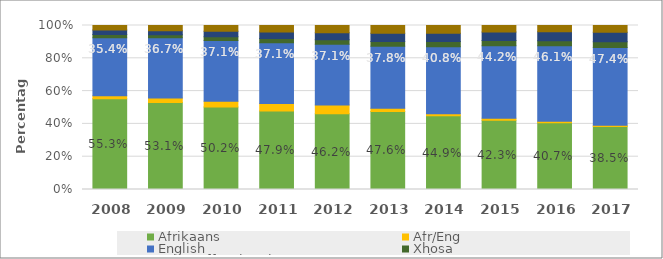
| Category | Afrikaans | Afr/Eng | English | Xhosa | Other official SA languages | Other |
|---|---|---|---|---|---|---|
| 2008 | 0.553 | 0.018 | 0.354 | 0.019 | 0.029 | 0.027 |
| 2009 | 0.531 | 0.028 | 0.367 | 0.017 | 0.026 | 0.031 |
| 2010 | 0.502 | 0.035 | 0.371 | 0.022 | 0.034 | 0.035 |
| 2011 | 0.479 | 0.045 | 0.371 | 0.025 | 0.04 | 0.04 |
| 2012 | 0.462 | 0.053 | 0.371 | 0.028 | 0.043 | 0.044 |
| 2013 | 0.476 | 0.019 | 0.378 | 0.03 | 0.05 | 0.048 |
| 2014 | 0.449 | 0.013 | 0.408 | 0.032 | 0.051 | 0.047 |
| 2015 | 0.423 | 0.011 | 0.442 | 0.032 | 0.053 | 0.039 |
| 2016 | 0.407 | 0.009 | 0.461 | 0.031 | 0.054 | 0.039 |
| 2017 | 0.385 | 0.008 | 0.474 | 0.034 | 0.058 | 0.042 |